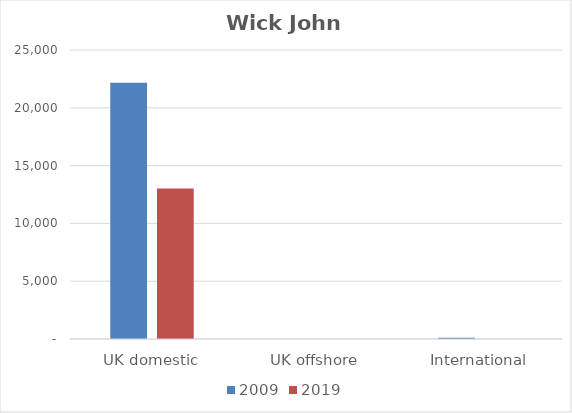
| Category | 2009 | 2019 |
|---|---|---|
| UK domestic | 22164 | 13029 |
| UK offshore | 9 | 0 |
| International | 105 | 0 |